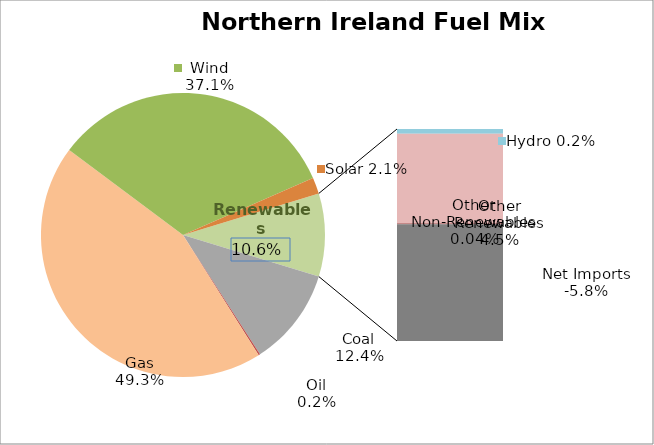
| Category | Series 0 |
|---|---|
| Coal | 0.124 |
| Oil | 0.002 |
| NR Peat | 0 |
| Gas | 0.493 |
| Wind | 0.371 |
| Solar | 0.021 |
| Hydro | 0.002 |
| Other Renewables | 0.045 |
| Other Non-Renewables | 0 |
| Net Imports | -0.058 |